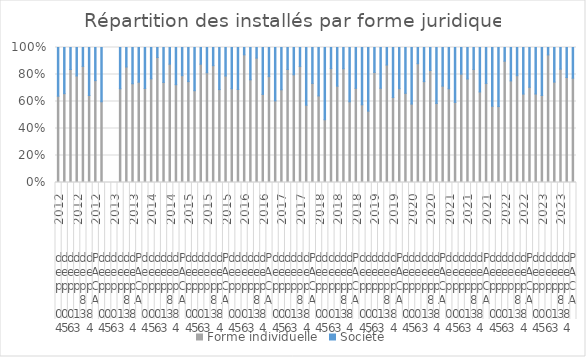
| Category | Forme individuelle | Société |
|---|---|---|
| 0 | 62 | 35 |
| 1 | 52 | 27 |
| 2 | 77 | 15 |
| 3 | 146 | 39 |
| 4 | 160 | 26 |
| 5 | 87 | 48 |
| 6 | 584 | 190 |
| 7 | 58 | 39 |
| 8 | 0 | 0 |
| 9 | 0 | 0 |
| 10 | 150 | 66 |
| 11 | 172 | 29 |
| 12 | 109 | 40 |
| 13 | 609 | 211 |
| 14 | 62 | 27 |
| 15 | 53 | 16 |
| 16 | 100 | 8 |
| 17 | 129 | 45 |
| 18 | 156 | 22 |
| 19 | 121 | 46 |
| 20 | 621 | 164 |
| 21 | 71 | 24 |
| 22 | 51 | 24 |
| 23 | 78 | 11 |
| 24 | 135 | 31 |
| 25 | 180 | 28 |
| 26 | 106 | 48 |
| 27 | 621 | 166 |
| 28 | 84 | 37 |
| 29 | 62 | 28 |
| 30 | 87 | 5 |
| 31 | 124 | 39 |
| 32 | 224 | 19 |
| 33 | 124 | 66 |
| 34 | 705 | 194 |
| 35 | 55 | 36 |
| 36 | 57 | 26 |
| 37 | 72 | 14 |
| 38 | 150 | 38 |
| 39 | 141 | 23 |
| 40 | 91 | 68 |
| 41 | 566 | 205 |
| 42 | 59 | 33 |
| 43 | 33 | 38 |
| 44 | 54 | 10 |
| 45 | 112 | 45 |
| 46 | 166 | 31 |
| 47 | 113 | 76 |
| 48 | 537 | 233 |
| 49 | 61 | 45 |
| 50 | 37 | 33 |
| 51 | 53 | 12 |
| 52 | 118 | 51 |
| 53 | 134 | 20 |
| 54 | 109 | 64 |
| 55 | 512 | 225 |
| 56 | 74 | 38 |
| 57 | 43 | 31 |
| 58 | 66 | 9 |
| 59 | 130 | 44 |
| 60 | 151 | 31 |
| 61 | 106 | 75 |
| 62 | 569 | 228 |
| 63 | 84 | 37 |
| 64 | 51 | 35 |
| 65 | 61 | 15 |
| 66 | 115 | 35 |
| 67 | 139 | 27 |
| 68 | 110 | 54 |
| 69 | 560 | 203 |
| 70 | 70 | 54 |
| 71 | 54 | 42 |
| 72 | 71 | 8 |
| 73 | 143 | 47 |
| 74 | 159 | 42 |
| 75 | 133 | 70 |
| 76 | 630 | 263 |
| 77 | 80 | 42 |
| 78 | 49 | 27 |
| 79 | 86 | 5 |
| 80 | 119 | 41 |
| 81 | 152 | 29 |
| 82 | 133 | 38 |
| 83 | 619 | 182 |